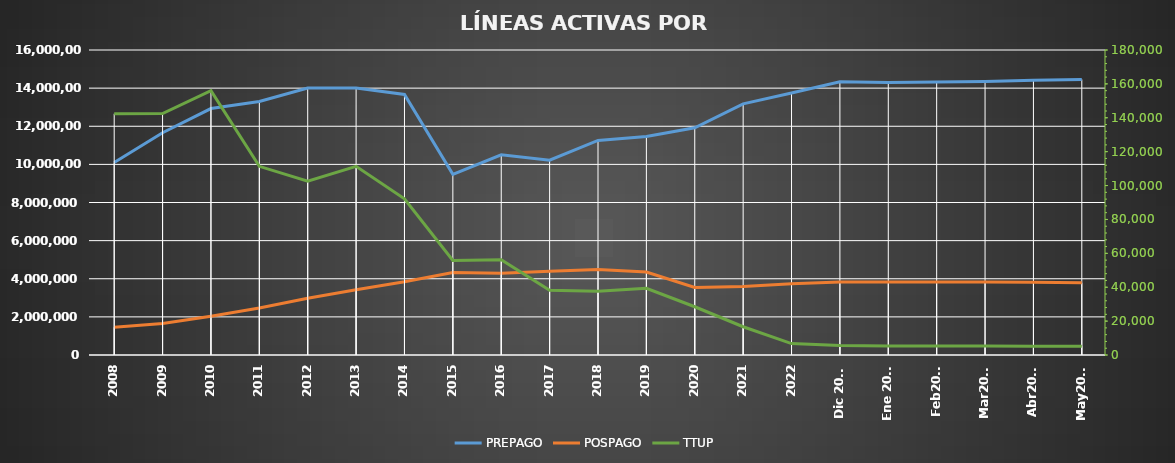
| Category | PREPAGO | POSPAGO |
|---|---|---|
| 2008 | 10097768 | 1452088 |
| 2009 | 11662294 | 1649838 |
| 2010 | 12929040 | 2033814 |
| 2011 | 13295834 | 2467378 |
| 2012 | 14008104 | 2976194 |
| 2013 | 14005126 | 3425277 |
| 2014 | 13666071 | 3846271 |
| 2015 | 9476240 | 4326937 |
| 2016 | 10498467 | 4293426 |
| 2017 | 10219457 | 4393703 |
| 2018 | 11254168 | 4480975 |
| 2019 | 11462048 | 4351686 |
| 2020 | 11917697 | 3539192 |
| 2021 | 13174530 | 3598383 |
| 2022 | 13740159 | 3743849 |
| Dic 2023 | 14330010 | 3829924 |
| Ene 2024 | 14292675 | 3831687 |
| Feb2024 | 14318625 | 3825224 |
| Mar2024 | 14343789 | 3823722 |
| Abr2024 | 14417661 | 3812295 |
| May2024 | 14454224 | 3790659 |